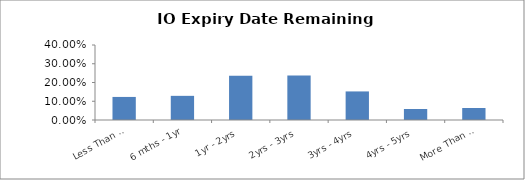
| Category | Series 0 |
|---|---|
| Less Than 6 mths | 0.123 |
| 6 mths - 1yr | 0.129 |
| 1yr - 2yrs | 0.236 |
| 2yrs - 3yrs | 0.237 |
| 3yrs - 4yrs | 0.152 |
| 4yrs - 5yrs | 0.059 |
| More Than 5 yrs | 0.064 |